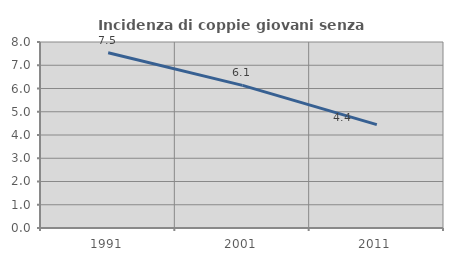
| Category | Incidenza di coppie giovani senza figli |
|---|---|
| 1991.0 | 7.535 |
| 2001.0 | 6.134 |
| 2011.0 | 4.444 |